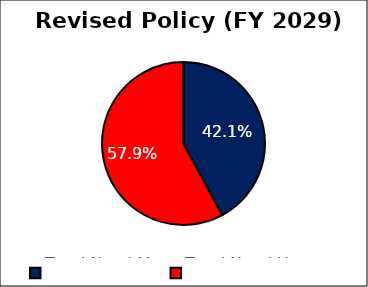
| Category | Revised
Policy |
|---|---|
| Total Need Met | 0.421 |
| Total Need Unmet | 0.579 |